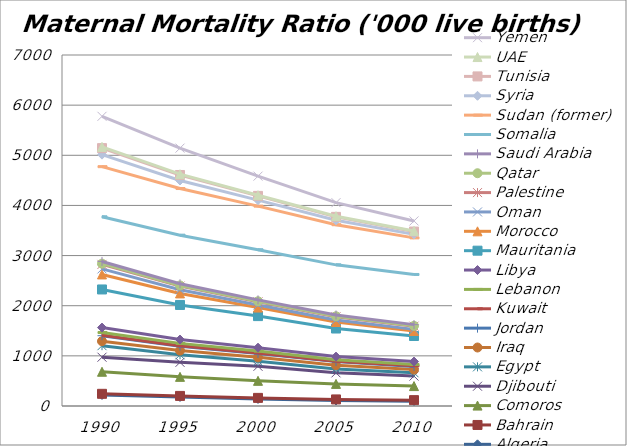
| Category | Algeria | Bahrain | Comoros | Djibouti | Egypt | Iraq | Jordan | Kuwait  | Lebanon | Libya | Mauritania | Morocco | Oman | Palestine | Qatar | Saudi Arabia | Somalia | Sudan (former) | Syria | Tunisia | UAE | Yemen |
|---|---|---|---|---|---|---|---|---|---|---|---|---|---|---|---|---|---|---|---|---|---|---|
| 1990.0 | 220 | 23 | 440 | 290 | 230 | 89 | 110 | 11 | 52 | 99 | 760 | 300 | 110 | 90 | 15 | 44 | 890 | 1000 | 240 | 130 | 24 | 610 |
| 1995.0 | 180 | 21 | 380 | 290 | 150 | 84 | 88 | 10 | 46 | 76 | 690 | 230 | 74 | 72 | 13 | 33 | 970 | 930 | 160 | 110 | 16 | 520 |
| 2000.0 | 140 | 22 | 340 | 290 | 100 | 78 | 79 | 9 | 38 | 67 | 630 | 170 | 51 | 64 | 11 | 27 | 1000 | 870 | 120 | 84 | 14 | 380 |
| 2005.0 | 110 | 21 | 310 | 220 | 78 | 74 | 72 | 8 | 31 | 61 | 560 | 130 | 39 | 67 | 9 | 25 | 1000 | 800 | 89 | 68 | 13 | 270 |
| 2010.0 | 97 | 20 | 280 | 200 | 66 | 63 | 63 | 14 | 25 | 58 | 510 | 100 | 32 | 64 | 7 | 24 | 1000 | 730 | 70 | 56 | 12 | 200 |